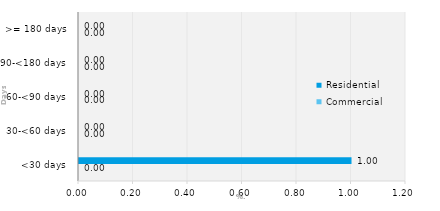
| Category | Commercial | Residential |
|---|---|---|
| <30 days | 0 | 1 |
| 30-<60 days | 0 | 0 |
| 60-<90 days | 0 | 0 |
| 90-<180 days | 0 | 0 |
| >= 180 days | 0 | 0 |